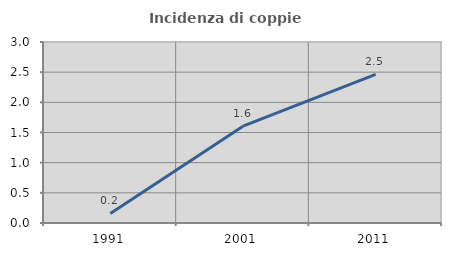
| Category | Incidenza di coppie miste |
|---|---|
| 1991.0 | 0.159 |
| 2001.0 | 1.605 |
| 2011.0 | 2.465 |